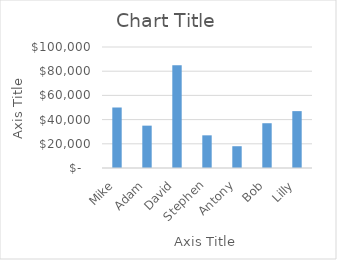
| Category | Series 0 |
|---|---|
| Mike | 50000 |
| Adam | 35000 |
| David | 85000 |
| Stephen | 27000 |
| Antony | 18000 |
| Bob | 37000 |
| Lilly | 47000 |